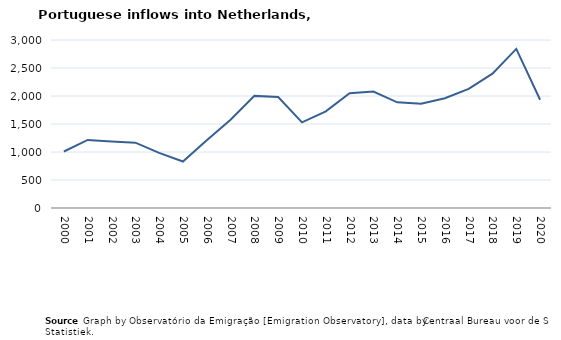
| Category | Entradas |
|---|---|
| 2000.0 | 1009 |
| 2001.0 | 1216 |
| 2002.0 | 1189 |
| 2003.0 | 1166 |
| 2004.0 | 984 |
| 2005.0 | 830 |
| 2006.0 | 1211 |
| 2007.0 | 1577 |
| 2008.0 | 2002 |
| 2009.0 | 1983 |
| 2010.0 | 1530 |
| 2011.0 | 1727 |
| 2012.0 | 2051 |
| 2013.0 | 2079 |
| 2014.0 | 1887 |
| 2015.0 | 1860 |
| 2016.0 | 1961 |
| 2017.0 | 2127 |
| 2018.0 | 2400 |
| 2019.0 | 2841 |
| 2020.0 | 1933 |